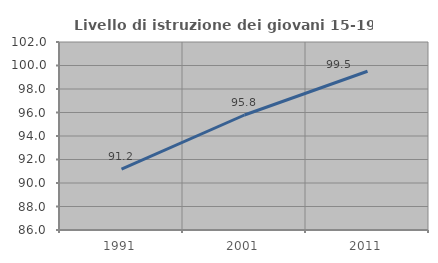
| Category | Livello di istruzione dei giovani 15-19 anni |
|---|---|
| 1991.0 | 91.176 |
| 2001.0 | 95.787 |
| 2011.0 | 99.51 |